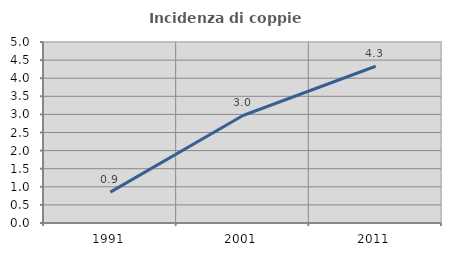
| Category | Incidenza di coppie miste |
|---|---|
| 1991.0 | 0.853 |
| 2001.0 | 2.97 |
| 2011.0 | 4.33 |